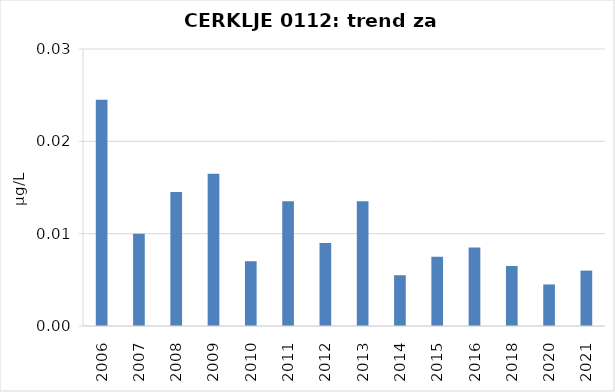
| Category | Vsota |
|---|---|
| 2006 | 0.024 |
| 2007 | 0.01 |
| 2008 | 0.014 |
| 2009 | 0.016 |
| 2010 | 0.007 |
| 2011 | 0.014 |
| 2012 | 0.009 |
| 2013 | 0.014 |
| 2014 | 0.006 |
| 2015 | 0.008 |
| 2016 | 0.008 |
| 2018 | 0.007 |
| 2020 | 0.005 |
| 2021 | 0.006 |